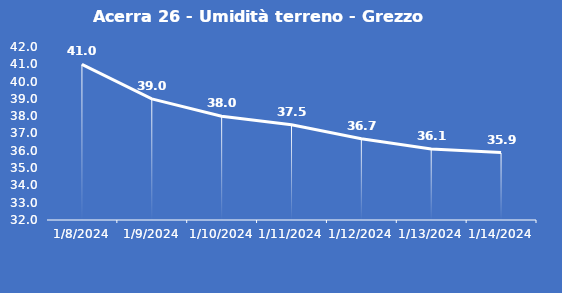
| Category | Acerra 26 - Umidità terreno - Grezzo (%VWC) |
|---|---|
| 1/8/24 | 41 |
| 1/9/24 | 39 |
| 1/10/24 | 38 |
| 1/11/24 | 37.5 |
| 1/12/24 | 36.7 |
| 1/13/24 | 36.1 |
| 1/14/24 | 35.9 |